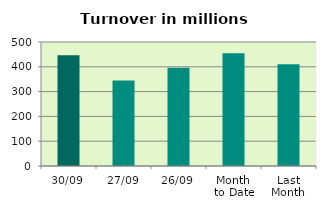
| Category | Series 0 |
|---|---|
| 30/09 | 446.132 |
| 27/09 | 344.498 |
| 26/09 | 396.133 |
| Month 
to Date | 454.566 |
| Last
Month | 410.207 |